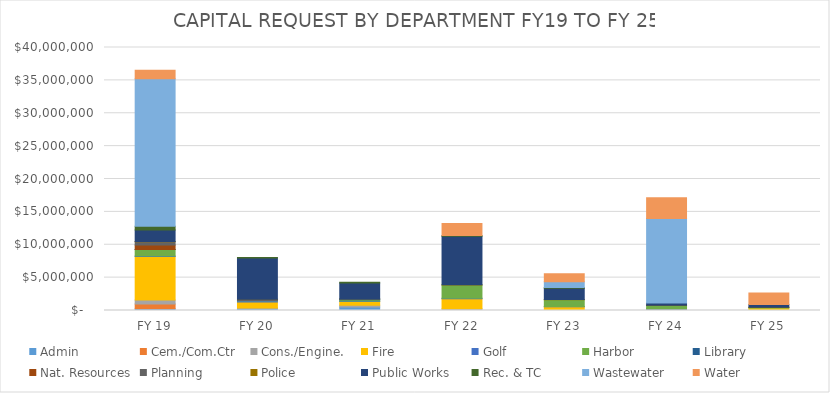
| Category | Admin | Cem./Com.Ctr | Cons./Engine. | Fire | Golf | Harbor | Library | Nat. Resources | Planning | Police | Public Works | Rec. & TC | Wastewater | Water |
|---|---|---|---|---|---|---|---|---|---|---|---|---|---|---|
| FY 19 | 282500 | 702578 | 621000 | 6588000 | 109000 | 956000 | 10340 | 704103 | 500000 | 36000 | 1740000 | 546500 | 22450000 | 1303700 |
| FY 20 | 281000 | 0 | 100000 | 900000 | 183000 | 50000 | 0 | 0 | 200000 | 13700 | 6270210 | 80000 | 0 | 0 |
| FY 21 | 550000 | 0 | 250000 | 557500 | 88000 | 200000 | 100000 | 0 | 0 | 14400 | 2419125 | 125000 | 0 | 0 |
| FY 22 | 0 | 0 | 250000 | 1550000 | 80000 | 2000000 | 0 | 0 | 0 | 30000 | 7366072 | 144500 | 0 | 1825000 |
| FY 23 | 0 | 0 | 0 | 575375 | 50000 | 1000000 | 0 | 0 | 0 | 40000 | 1725000 | 125000 | 840000 | 1250000 |
| FY 24 | 0 | 0 | 0 | 200000 | 50000 | 500000 | 0 | 0 | 0 | 61000 | 320000 | 0 | 12860000 | 3175000 |
| FY 25 | 0 | 0 | 0 | 394145 | 0 | 75000 | 0 | 0 | 0 | 35000 | 405000 | 0 | 0 | 1750000 |